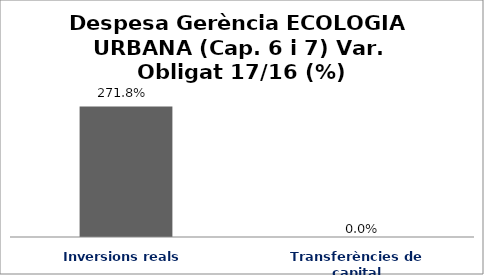
| Category | Series 0 |
|---|---|
| Inversions reals | 2.718 |
| Transferències de capital | 0 |